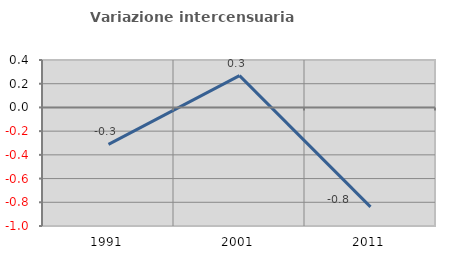
| Category | Variazione intercensuaria annua |
|---|---|
| 1991.0 | -0.311 |
| 2001.0 | 0.268 |
| 2011.0 | -0.839 |